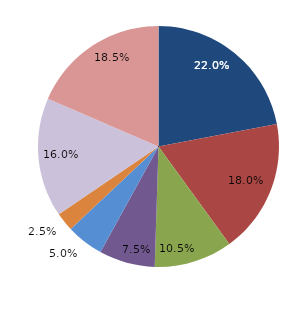
| Category | Series 0 |
|---|---|
| قبل الدخول | 22 |
| -1 | 18 |
| 1 | 10.5 |
| 2 | 7.5 |
| 3 | 5 |
| 4 | 2.5 |
|  5 - 9 | 16 |
| 10 - 14 | 18.5 |